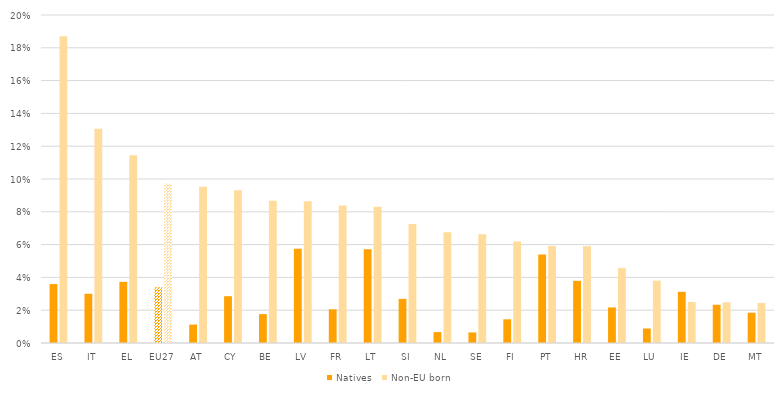
| Category | Natives | Non-EU born |
|---|---|---|
| ES | 0.036 | 0.187 |
| IT | 0.03 | 0.131 |
| EL | 0.037 | 0.115 |
| EU27 | 0.034 | 0.097 |
| AT | 0.011 | 0.095 |
| CY | 0.029 | 0.093 |
| BE | 0.018 | 0.087 |
| LV | 0.057 | 0.086 |
| FR | 0.021 | 0.084 |
| LT | 0.057 | 0.083 |
| SI | 0.027 | 0.073 |
| NL | 0.007 | 0.067 |
| SE | 0.006 | 0.066 |
| FI | 0.014 | 0.062 |
| PT | 0.054 | 0.059 |
| HR | 0.038 | 0.059 |
| EE | 0.022 | 0.046 |
| LU | 0.009 | 0.038 |
| IE | 0.031 | 0.025 |
| DE | 0.023 | 0.025 |
| MT | 0.018 | 0.024 |